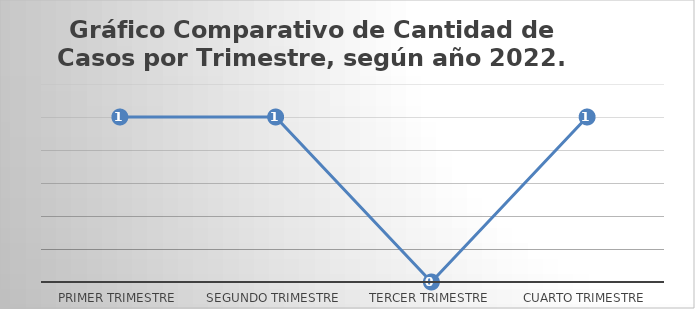
| Category | Series 0 |
|---|---|
| Primer Trimestre | 1 |
| Segundo Trimestre | 1 |
| Tercer Trimestre | 0 |
| Cuarto Trimestre | 1 |